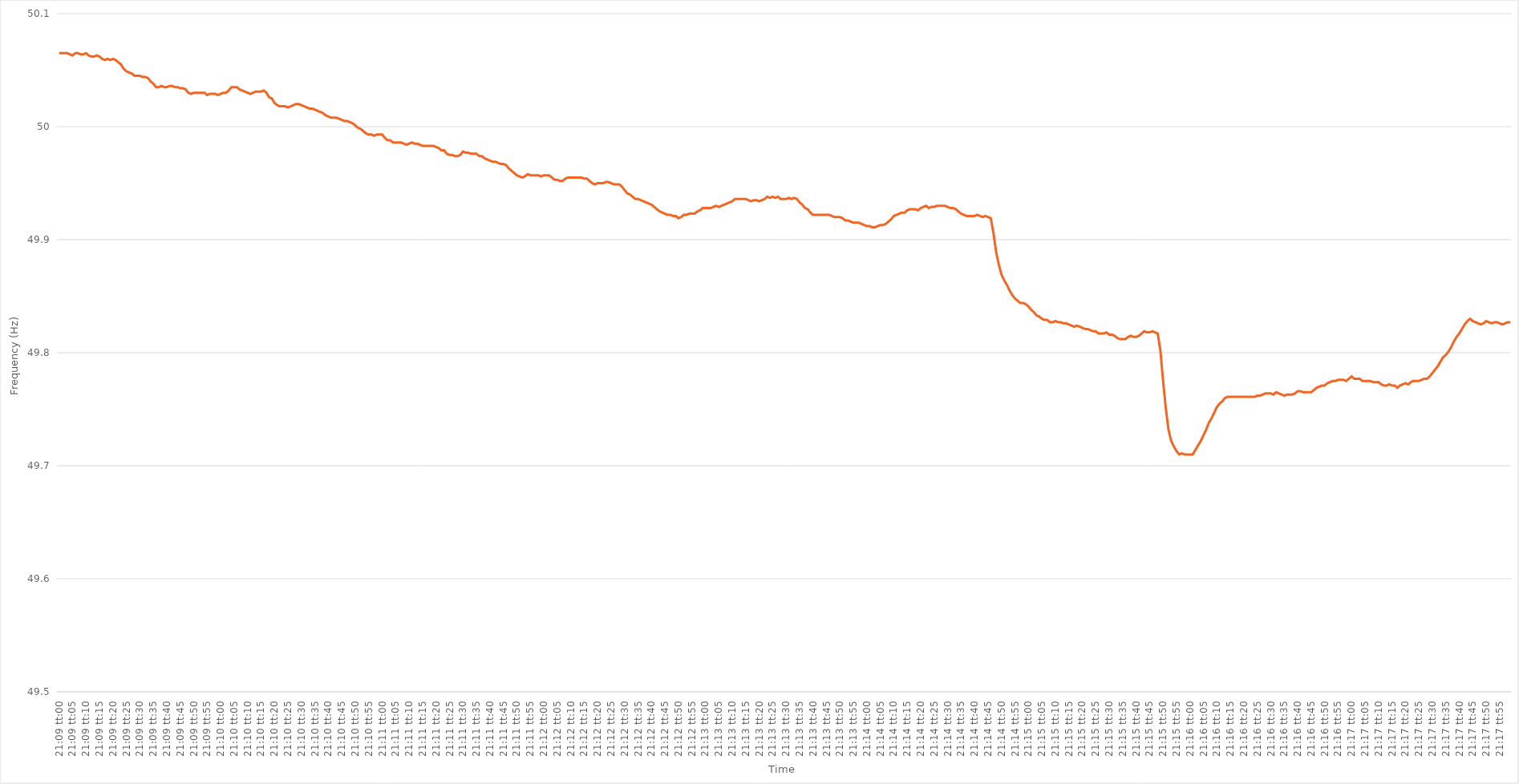
| Category | Series 0 |
|---|---|
| 0.88125 | 50.065 |
| 0.881261574074074 | 50.065 |
| 0.8812731481481482 | 50.065 |
| 0.8812847222222223 | 50.065 |
| 0.8812962962962962 | 50.064 |
| 0.8813078703703704 | 50.063 |
| 0.8813194444444444 | 50.065 |
| 0.8813310185185186 | 50.065 |
| 0.8813425925925925 | 50.064 |
| 0.8813541666666667 | 50.064 |
| 0.8813657407407408 | 50.065 |
| 0.8813773148148148 | 50.063 |
| 0.8813888888888889 | 50.062 |
| 0.8814004629629629 | 50.062 |
| 0.8814120370370371 | 50.063 |
| 0.881423611111111 | 50.062 |
| 0.8814351851851852 | 50.06 |
| 0.8814467592592593 | 50.059 |
| 0.8814583333333333 | 50.06 |
| 0.8814699074074074 | 50.059 |
| 0.8814814814814814 | 50.06 |
| 0.8814930555555556 | 50.059 |
| 0.8815046296296297 | 50.057 |
| 0.8815162037037036 | 50.055 |
| 0.8815277777777778 | 50.051 |
| 0.8815393518518518 | 50.049 |
| 0.881550925925926 | 50.048 |
| 0.8815624999999999 | 50.047 |
| 0.8815740740740741 | 50.045 |
| 0.8815856481481482 | 50.045 |
| 0.8815972222222223 | 50.045 |
| 0.8816087962962963 | 50.044 |
| 0.8816203703703703 | 50.044 |
| 0.8816319444444445 | 50.043 |
| 0.8816435185185184 | 50.04 |
| 0.8816550925925926 | 50.038 |
| 0.8816666666666667 | 50.035 |
| 0.8816782407407407 | 50.035 |
| 0.8816898148148148 | 50.036 |
| 0.8817013888888888 | 50.035 |
| 0.881712962962963 | 50.035 |
| 0.8817245370370371 | 50.036 |
| 0.881736111111111 | 50.036 |
| 0.8817476851851852 | 50.035 |
| 0.8817592592592592 | 50.035 |
| 0.8817708333333334 | 50.034 |
| 0.8817824074074073 | 50.034 |
| 0.8817939814814815 | 50.033 |
| 0.8818055555555556 | 50.03 |
| 0.8818171296296297 | 50.029 |
| 0.8818287037037037 | 50.03 |
| 0.8818402777777777 | 50.03 |
| 0.8818518518518519 | 50.03 |
| 0.881863425925926 | 50.03 |
| 0.881875 | 50.03 |
| 0.8818865740740741 | 50.028 |
| 0.8818981481481482 | 50.029 |
| 0.8819097222222222 | 50.029 |
| 0.8819212962962962 | 50.029 |
| 0.8819328703703704 | 50.028 |
| 0.8819444444444445 | 50.029 |
| 0.8819560185185185 | 50.03 |
| 0.8819675925925926 | 50.03 |
| 0.8819791666666666 | 50.032 |
| 0.8819907407407408 | 50.035 |
| 0.8820023148148147 | 50.035 |
| 0.8820138888888889 | 50.035 |
| 0.882025462962963 | 50.033 |
| 0.8820370370370371 | 50.032 |
| 0.8820486111111111 | 50.031 |
| 0.8820601851851851 | 50.03 |
| 0.8820717592592593 | 50.029 |
| 0.8820833333333334 | 50.03 |
| 0.8820949074074074 | 50.031 |
| 0.8821064814814815 | 50.031 |
| 0.8821180555555556 | 50.031 |
| 0.8821296296296296 | 50.032 |
| 0.8821412037037036 | 50.03 |
| 0.8821527777777778 | 50.026 |
| 0.8821643518518519 | 50.025 |
| 0.8821759259259259 | 50.021 |
| 0.8821875 | 50.019 |
| 0.882199074074074 | 50.018 |
| 0.8822106481481482 | 50.018 |
| 0.8822222222222221 | 50.018 |
| 0.8822337962962963 | 50.017 |
| 0.8822453703703704 | 50.018 |
| 0.8822569444444445 | 50.019 |
| 0.8822685185185185 | 50.02 |
| 0.8822800925925925 | 50.02 |
| 0.8822916666666667 | 50.019 |
| 0.8823032407407408 | 50.018 |
| 0.8823148148148148 | 50.017 |
| 0.8823263888888889 | 50.016 |
| 0.882337962962963 | 50.016 |
| 0.882349537037037 | 50.015 |
| 0.882361111111111 | 50.014 |
| 0.8823726851851852 | 50.013 |
| 0.8823842592592593 | 50.012 |
| 0.8823958333333333 | 50.01 |
| 0.8824074074074074 | 50.009 |
| 0.8824189814814815 | 50.008 |
| 0.8824305555555556 | 50.008 |
| 0.8824421296296295 | 50.008 |
| 0.8824537037037037 | 50.007 |
| 0.8824652777777778 | 50.006 |
| 0.8824768518518519 | 50.005 |
| 0.8824884259259259 | 50.005 |
| 0.8825 | 50.004 |
| 0.8825115740740741 | 50.003 |
| 0.8825231481481483 | 50.001 |
| 0.8825347222222222 | 49.999 |
| 0.8825462962962963 | 49.998 |
| 0.8825578703703704 | 49.996 |
| 0.8825694444444445 | 49.994 |
| 0.8825810185185184 | 49.993 |
| 0.8825925925925926 | 49.993 |
| 0.8826041666666667 | 49.992 |
| 0.8826157407407407 | 49.993 |
| 0.8826273148148148 | 49.993 |
| 0.8826388888888889 | 49.993 |
| 0.882650462962963 | 49.99 |
| 0.8826620370370369 | 49.988 |
| 0.8826736111111111 | 49.988 |
| 0.8826851851851852 | 49.986 |
| 0.8826967592592593 | 49.986 |
| 0.8827083333333333 | 49.986 |
| 0.8827199074074074 | 49.986 |
| 0.8827314814814815 | 49.985 |
| 0.8827430555555557 | 49.984 |
| 0.8827546296296296 | 49.985 |
| 0.8827662037037037 | 49.986 |
| 0.8827777777777778 | 49.985 |
| 0.8827893518518519 | 49.985 |
| 0.8828009259259259 | 49.984 |
| 0.8828125 | 49.983 |
| 0.8828240740740741 | 49.983 |
| 0.8828356481481481 | 49.983 |
| 0.8828472222222222 | 49.983 |
| 0.8828587962962963 | 49.983 |
| 0.8828703703703704 | 49.982 |
| 0.8828819444444443 | 49.981 |
| 0.8828935185185185 | 49.979 |
| 0.8829050925925926 | 49.979 |
| 0.8829166666666667 | 49.976 |
| 0.8829282407407407 | 49.975 |
| 0.8829398148148148 | 49.975 |
| 0.8829513888888889 | 49.974 |
| 0.8829629629629631 | 49.974 |
| 0.882974537037037 | 49.975 |
| 0.8829861111111111 | 49.978 |
| 0.8829976851851852 | 49.977 |
| 0.8830092592592593 | 49.977 |
| 0.8830208333333333 | 49.976 |
| 0.8830324074074074 | 49.976 |
| 0.8830439814814816 | 49.976 |
| 0.8830555555555555 | 49.974 |
| 0.8830671296296296 | 49.974 |
| 0.8830787037037037 | 49.972 |
| 0.8830902777777778 | 49.971 |
| 0.8831018518518517 | 49.97 |
| 0.8831134259259259 | 49.969 |
| 0.883125 | 49.969 |
| 0.8831365740740741 | 49.968 |
| 0.8831481481481481 | 49.967 |
| 0.8831597222222222 | 49.967 |
| 0.8831712962962963 | 49.966 |
| 0.8831828703703705 | 49.963 |
| 0.8831944444444444 | 49.961 |
| 0.8832060185185185 | 49.959 |
| 0.8832175925925926 | 49.957 |
| 0.8832291666666667 | 49.956 |
| 0.8832407407407407 | 49.955 |
| 0.8832523148148148 | 49.956 |
| 0.883263888888889 | 49.958 |
| 0.883275462962963 | 49.957 |
| 0.883287037037037 | 49.957 |
| 0.8832986111111111 | 49.957 |
| 0.8833101851851852 | 49.957 |
| 0.8833217592592592 | 49.956 |
| 0.8833333333333333 | 49.957 |
| 0.8833449074074075 | 49.957 |
| 0.8833564814814815 | 49.957 |
| 0.8833680555555555 | 49.955 |
| 0.8833796296296296 | 49.953 |
| 0.8833912037037037 | 49.953 |
| 0.8834027777777779 | 49.952 |
| 0.8834143518518518 | 49.952 |
| 0.883425925925926 | 49.954 |
| 0.8834375 | 49.955 |
| 0.8834490740740741 | 49.955 |
| 0.8834606481481481 | 49.955 |
| 0.8834722222222222 | 49.955 |
| 0.8834837962962964 | 49.955 |
| 0.8834953703703704 | 49.955 |
| 0.8835069444444444 | 49.954 |
| 0.8835185185185185 | 49.954 |
| 0.8835300925925926 | 49.952 |
| 0.8835416666666666 | 49.95 |
| 0.8835532407407407 | 49.949 |
| 0.8835648148148149 | 49.95 |
| 0.8835763888888889 | 49.95 |
| 0.8835879629629629 | 49.95 |
| 0.883599537037037 | 49.951 |
| 0.8836111111111111 | 49.951 |
| 0.8836226851851853 | 49.95 |
| 0.8836342592592592 | 49.949 |
| 0.8836458333333334 | 49.949 |
| 0.8836574074074074 | 49.949 |
| 0.8836689814814815 | 49.947 |
| 0.8836805555555555 | 49.944 |
| 0.8836921296296296 | 49.941 |
| 0.8837037037037038 | 49.94 |
| 0.8837152777777778 | 49.938 |
| 0.8837268518518518 | 49.936 |
| 0.8837384259259259 | 49.936 |
| 0.88375 | 49.935 |
| 0.883761574074074 | 49.934 |
| 0.8837731481481481 | 49.933 |
| 0.8837847222222223 | 49.932 |
| 0.8837962962962963 | 49.931 |
| 0.8838078703703703 | 49.929 |
| 0.8838194444444444 | 49.927 |
| 0.8838310185185185 | 49.925 |
| 0.8838425925925927 | 49.924 |
| 0.8838541666666666 | 49.923 |
| 0.8838657407407408 | 49.922 |
| 0.8838773148148148 | 49.922 |
| 0.883888888888889 | 49.921 |
| 0.8839004629629629 | 49.921 |
| 0.883912037037037 | 49.919 |
| 0.8839236111111112 | 49.92 |
| 0.8839351851851852 | 49.922 |
| 0.8839467592592593 | 49.922 |
| 0.8839583333333333 | 49.923 |
| 0.8839699074074074 | 49.923 |
| 0.8839814814814816 | 49.923 |
| 0.8839930555555555 | 49.925 |
| 0.8840046296296297 | 49.926 |
| 0.8840162037037037 | 49.928 |
| 0.8840277777777777 | 49.928 |
| 0.8840393518518518 | 49.928 |
| 0.8840509259259259 | 49.928 |
| 0.8840625000000001 | 49.929 |
| 0.884074074074074 | 49.93 |
| 0.8840856481481482 | 49.929 |
| 0.8840972222222222 | 49.93 |
| 0.8841087962962964 | 49.931 |
| 0.8841203703703703 | 49.932 |
| 0.8841319444444444 | 49.933 |
| 0.8841435185185186 | 49.934 |
| 0.8841550925925926 | 49.936 |
| 0.8841666666666667 | 49.936 |
| 0.8841782407407407 | 49.936 |
| 0.8841898148148148 | 49.936 |
| 0.884201388888889 | 49.936 |
| 0.8842129629629629 | 49.935 |
| 0.8842245370370371 | 49.934 |
| 0.8842361111111111 | 49.935 |
| 0.8842476851851852 | 49.935 |
| 0.8842592592592592 | 49.934 |
| 0.8842708333333333 | 49.935 |
| 0.8842824074074075 | 49.936 |
| 0.8842939814814814 | 49.938 |
| 0.8843055555555556 | 49.937 |
| 0.8843171296296296 | 49.938 |
| 0.8843287037037038 | 49.937 |
| 0.8843402777777777 | 49.938 |
| 0.8843518518518518 | 49.936 |
| 0.884363425925926 | 49.936 |
| 0.884375 | 49.936 |
| 0.8843865740740741 | 49.937 |
| 0.8843981481481481 | 49.936 |
| 0.8844097222222222 | 49.937 |
| 0.8844212962962964 | 49.936 |
| 0.8844328703703703 | 49.933 |
| 0.8844444444444445 | 49.931 |
| 0.8844560185185185 | 49.928 |
| 0.8844675925925927 | 49.927 |
| 0.8844791666666666 | 49.924 |
| 0.8844907407407407 | 49.922 |
| 0.8845023148148149 | 49.922 |
| 0.8845138888888888 | 49.922 |
| 0.884525462962963 | 49.922 |
| 0.884537037037037 | 49.922 |
| 0.8845486111111112 | 49.922 |
| 0.8845601851851851 | 49.922 |
| 0.8845717592592592 | 49.921 |
| 0.8845833333333334 | 49.92 |
| 0.8845949074074074 | 49.92 |
| 0.8846064814814815 | 49.92 |
| 0.8846180555555555 | 49.919 |
| 0.8846296296296297 | 49.917 |
| 0.8846412037037038 | 49.917 |
| 0.8846527777777777 | 49.916 |
| 0.8846643518518519 | 49.915 |
| 0.8846759259259259 | 49.915 |
| 0.8846875000000001 | 49.915 |
| 0.884699074074074 | 49.914 |
| 0.8847106481481481 | 49.913 |
| 0.8847222222222223 | 49.912 |
| 0.8847337962962962 | 49.912 |
| 0.8847453703703704 | 49.911 |
| 0.8847569444444444 | 49.911 |
| 0.8847685185185186 | 49.912 |
| 0.8847800925925925 | 49.913 |
| 0.8847916666666666 | 49.913 |
| 0.8848032407407408 | 49.914 |
| 0.8848148148148148 | 49.916 |
| 0.8848263888888889 | 49.918 |
| 0.8848379629629629 | 49.921 |
| 0.8848495370370371 | 49.922 |
| 0.8848611111111112 | 49.923 |
| 0.8848726851851851 | 49.924 |
| 0.8848842592592593 | 49.924 |
| 0.8848958333333333 | 49.926 |
| 0.8849074074074075 | 49.927 |
| 0.8849189814814814 | 49.927 |
| 0.8849305555555556 | 49.927 |
| 0.8849421296296297 | 49.926 |
| 0.8849537037037036 | 49.928 |
| 0.8849652777777778 | 49.929 |
| 0.8849768518518518 | 49.93 |
| 0.884988425925926 | 49.928 |
| 0.8849999999999999 | 49.929 |
| 0.885011574074074 | 49.929 |
| 0.8850231481481482 | 49.93 |
| 0.8850347222222222 | 49.93 |
| 0.8850462962962963 | 49.93 |
| 0.8850578703703703 | 49.93 |
| 0.8850694444444445 | 49.929 |
| 0.8850810185185186 | 49.928 |
| 0.8850925925925925 | 49.928 |
| 0.8851041666666667 | 49.927 |
| 0.8851157407407407 | 49.925 |
| 0.8851273148148149 | 49.923 |
| 0.8851388888888888 | 49.922 |
| 0.885150462962963 | 49.921 |
| 0.8851620370370371 | 49.921 |
| 0.8851736111111111 | 49.921 |
| 0.8851851851851852 | 49.921 |
| 0.8851967592592592 | 49.922 |
| 0.8852083333333334 | 49.921 |
| 0.8852199074074073 | 49.92 |
| 0.8852314814814815 | 49.921 |
| 0.8852430555555556 | 49.92 |
| 0.8852546296296296 | 49.919 |
| 0.8852662037037037 | 49.906 |
| 0.8852777777777777 | 49.889 |
| 0.8852893518518519 | 49.878 |
| 0.885300925925926 | 49.869 |
| 0.8853125 | 49.864 |
| 0.8853240740740741 | 49.86 |
| 0.8853356481481481 | 49.855 |
| 0.8853472222222223 | 49.851 |
| 0.8853587962962962 | 49.848 |
| 0.8853703703703704 | 49.846 |
| 0.8853819444444445 | 49.844 |
| 0.8853935185185186 | 49.844 |
| 0.8854050925925926 | 49.843 |
| 0.8854166666666666 | 49.841 |
| 0.8854282407407408 | 49.838 |
| 0.8854398148148147 | 49.836 |
| 0.8854513888888889 | 49.833 |
| 0.885462962962963 | 49.832 |
| 0.885474537037037 | 49.83 |
| 0.8854861111111111 | 49.829 |
| 0.8854976851851851 | 49.829 |
| 0.8855092592592593 | 49.827 |
| 0.8855208333333334 | 49.827 |
| 0.8855324074074074 | 49.828 |
| 0.8855439814814815 | 49.827 |
| 0.8855555555555555 | 49.827 |
| 0.8855671296296297 | 49.826 |
| 0.8855787037037036 | 49.826 |
| 0.8855902777777778 | 49.825 |
| 0.8856018518518519 | 49.824 |
| 0.885613425925926 | 49.823 |
| 0.885625 | 49.824 |
| 0.885636574074074 | 49.823 |
| 0.8856481481481482 | 49.822 |
| 0.8856597222222221 | 49.821 |
| 0.8856712962962963 | 49.821 |
| 0.8856828703703704 | 49.82 |
| 0.8856944444444445 | 49.819 |
| 0.8857060185185185 | 49.819 |
| 0.8857175925925925 | 49.817 |
| 0.8857291666666667 | 49.817 |
| 0.8857407407407408 | 49.817 |
| 0.8857523148148148 | 49.818 |
| 0.8857638888888889 | 49.816 |
| 0.885775462962963 | 49.816 |
| 0.8857870370370371 | 49.815 |
| 0.885798611111111 | 49.813 |
| 0.8858101851851852 | 49.812 |
| 0.8858217592592593 | 49.812 |
| 0.8858333333333334 | 49.812 |
| 0.8858449074074074 | 49.814 |
| 0.8858564814814814 | 49.815 |
| 0.8858680555555556 | 49.814 |
| 0.8858796296296297 | 49.814 |
| 0.8858912037037037 | 49.815 |
| 0.8859027777777778 | 49.817 |
| 0.8859143518518519 | 49.819 |
| 0.8859259259259259 | 49.818 |
| 0.8859374999999999 | 49.818 |
| 0.8859490740740741 | 49.819 |
| 0.8859606481481482 | 49.818 |
| 0.8859722222222222 | 49.817 |
| 0.8859837962962963 | 49.802 |
| 0.8859953703703703 | 49.775 |
| 0.8860069444444445 | 49.751 |
| 0.8860185185185184 | 49.732 |
| 0.8860300925925926 | 49.722 |
| 0.8860416666666667 | 49.717 |
| 0.8860532407407408 | 49.713 |
| 0.8860648148148148 | 49.71 |
| 0.8860763888888888 | 49.711 |
| 0.886087962962963 | 49.71 |
| 0.8860995370370371 | 49.71 |
| 0.8861111111111111 | 49.71 |
| 0.8861226851851852 | 49.71 |
| 0.8861342592592593 | 49.714 |
| 0.8861458333333333 | 49.718 |
| 0.8861574074074073 | 49.722 |
| 0.8861689814814815 | 49.727 |
| 0.8861805555555556 | 49.732 |
| 0.8861921296296296 | 49.738 |
| 0.8862037037037037 | 49.742 |
| 0.8862152777777778 | 49.747 |
| 0.8862268518518519 | 49.752 |
| 0.8862384259259258 | 49.755 |
| 0.88625 | 49.757 |
| 0.8862615740740741 | 49.76 |
| 0.8862731481481482 | 49.761 |
| 0.8862847222222222 | 49.761 |
| 0.8862962962962962 | 49.761 |
| 0.8863078703703704 | 49.761 |
| 0.8863194444444445 | 49.761 |
| 0.8863310185185185 | 49.761 |
| 0.8863425925925926 | 49.761 |
| 0.8863541666666667 | 49.761 |
| 0.8863657407407407 | 49.761 |
| 0.8863773148148147 | 49.761 |
| 0.8863888888888889 | 49.761 |
| 0.886400462962963 | 49.762 |
| 0.886412037037037 | 49.762 |
| 0.8864236111111111 | 49.763 |
| 0.8864351851851852 | 49.764 |
| 0.8864467592592593 | 49.764 |
| 0.8864583333333332 | 49.764 |
| 0.8864699074074074 | 49.763 |
| 0.8864814814814815 | 49.765 |
| 0.8864930555555556 | 49.764 |
| 0.8865046296296296 | 49.763 |
| 0.8865162037037037 | 49.762 |
| 0.8865277777777778 | 49.763 |
| 0.886539351851852 | 49.763 |
| 0.8865509259259259 | 49.763 |
| 0.8865625 | 49.764 |
| 0.8865740740740741 | 49.766 |
| 0.8865856481481482 | 49.766 |
| 0.8865972222222221 | 49.765 |
| 0.8866087962962963 | 49.765 |
| 0.8866203703703704 | 49.765 |
| 0.8866319444444444 | 49.765 |
| 0.8866435185185185 | 49.767 |
| 0.8866550925925926 | 49.769 |
| 0.8866666666666667 | 49.77 |
| 0.8866782407407406 | 49.771 |
| 0.8866898148148148 | 49.771 |
| 0.8867013888888889 | 49.773 |
| 0.886712962962963 | 49.774 |
| 0.886724537037037 | 49.775 |
| 0.8867361111111111 | 49.775 |
| 0.8867476851851852 | 49.776 |
| 0.8867592592592594 | 49.776 |
| 0.8867708333333333 | 49.776 |
| 0.8867824074074074 | 49.775 |
| 0.8867939814814815 | 49.777 |
| 0.8868055555555556 | 49.779 |
| 0.8868171296296296 | 49.777 |
| 0.8868287037037037 | 49.777 |
| 0.8868402777777779 | 49.777 |
| 0.8868518518518518 | 49.775 |
| 0.8868634259259259 | 49.775 |
| 0.886875 | 49.775 |
| 0.8868865740740741 | 49.775 |
| 0.886898148148148 | 49.774 |
| 0.8869097222222222 | 49.774 |
| 0.8869212962962963 | 49.774 |
| 0.8869328703703704 | 49.772 |
| 0.8869444444444444 | 49.771 |
| 0.8869560185185185 | 49.771 |
| 0.8869675925925926 | 49.772 |
| 0.8869791666666668 | 49.771 |
| 0.8869907407407407 | 49.771 |
| 0.8870023148148148 | 49.769 |
| 0.8870138888888889 | 49.771 |
| 0.887025462962963 | 49.772 |
| 0.887037037037037 | 49.773 |
| 0.8870486111111111 | 49.772 |
| 0.8870601851851853 | 49.774 |
| 0.8870717592592593 | 49.775 |
| 0.8870833333333333 | 49.775 |
| 0.8870949074074074 | 49.775 |
| 0.8871064814814815 | 49.776 |
| 0.8871180555555555 | 49.777 |
| 0.8871296296296296 | 49.777 |
| 0.8871412037037038 | 49.779 |
| 0.8871527777777778 | 49.782 |
| 0.8871643518518518 | 49.785 |
| 0.8871759259259259 | 49.788 |
| 0.8871875 | 49.792 |
| 0.8871990740740742 | 49.796 |
| 0.8872106481481481 | 49.798 |
| 0.8872222222222222 | 49.801 |
| 0.8872337962962963 | 49.805 |
| 0.8872453703703704 | 49.81 |
| 0.8872569444444444 | 49.814 |
| 0.8872685185185185 | 49.817 |
| 0.8872800925925927 | 49.821 |
| 0.8872916666666667 | 49.825 |
| 0.8873032407407407 | 49.828 |
| 0.8873148148148148 | 49.83 |
| 0.8873263888888889 | 49.828 |
| 0.8873379629629629 | 49.827 |
| 0.887349537037037 | 49.826 |
| 0.8873611111111112 | 49.825 |
| 0.8873726851851852 | 49.826 |
| 0.8873842592592592 | 49.828 |
| 0.8873958333333333 | 49.827 |
| 0.8874074074074074 | 49.826 |
| 0.8874189814814816 | 49.827 |
| 0.8874305555555555 | 49.827 |
| 0.8874421296296297 | 49.826 |
| 0.8874537037037037 | 49.825 |
| 0.8874652777777778 | 49.826 |
| 0.8874768518518518 | 49.827 |
| 0.8874884259259259 | 49.827 |